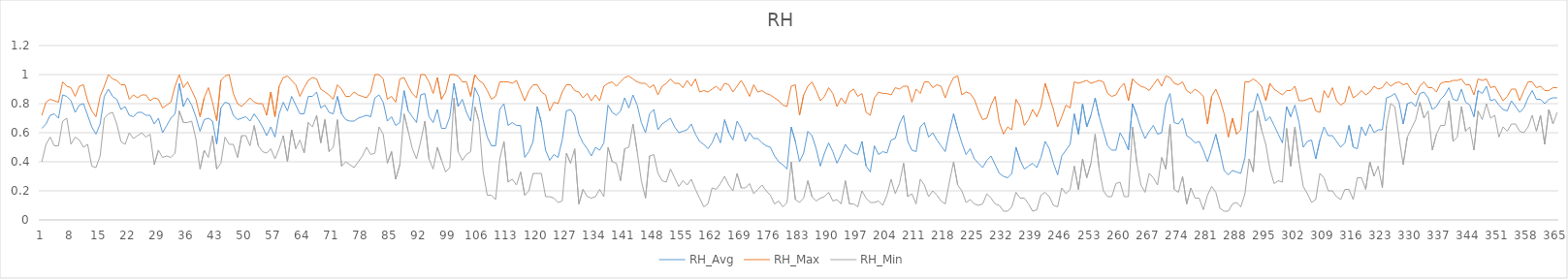
| Category | RH_Avg | RH_Max | RH_Min |
|---|---|---|---|
| 0 | 0.63 | 0.72 | 0.4 |
| 1 | 0.66 | 0.81 | 0.52 |
| 2 | 0.72 | 0.83 | 0.57 |
| 3 | 0.73 | 0.82 | 0.51 |
| 4 | 0.7 | 0.81 | 0.51 |
| 5 | 0.86 | 0.95 | 0.68 |
| 6 | 0.85 | 0.92 | 0.7 |
| 7 | 0.82 | 0.91 | 0.52 |
| 8 | 0.74 | 0.85 | 0.57 |
| 9 | 0.79 | 0.92 | 0.55 |
| 10 | 0.8 | 0.93 | 0.5 |
| 11 | 0.72 | 0.82 | 0.52 |
| 12 | 0.64 | 0.75 | 0.37 |
| 13 | 0.59 | 0.71 | 0.36 |
| 14 | 0.66 | 0.85 | 0.44 |
| 15 | 0.85 | 0.92 | 0.7 |
| 16 | 0.9 | 1 | 0.73 |
| 17 | 0.85 | 0.97 | 0.74 |
| 18 | 0.83 | 0.96 | 0.66 |
| 19 | 0.76 | 0.93 | 0.54 |
| 20 | 0.78 | 0.93 | 0.52 |
| 21 | 0.72 | 0.83 | 0.6 |
| 22 | 0.71 | 0.86 | 0.56 |
| 23 | 0.74 | 0.84 | 0.58 |
| 24 | 0.74 | 0.86 | 0.6 |
| 25 | 0.72 | 0.86 | 0.57 |
| 26 | 0.72 | 0.82 | 0.59 |
| 27 | 0.66 | 0.84 | 0.38 |
| 28 | 0.7 | 0.83 | 0.48 |
| 29 | 0.6 | 0.77 | 0.43 |
| 30 | 0.65 | 0.79 | 0.44 |
| 31 | 0.7 | 0.81 | 0.43 |
| 32 | 0.73 | 0.92 | 0.46 |
| 33 | 0.94 | 1 | 0.75 |
| 34 | 0.78 | 0.91 | 0.67 |
| 35 | 0.84 | 0.95 | 0.67 |
| 36 | 0.79 | 0.89 | 0.68 |
| 37 | 0.71 | 0.83 | 0.56 |
| 38 | 0.61 | 0.71 | 0.35 |
| 39 | 0.69 | 0.84 | 0.48 |
| 40 | 0.7 | 0.91 | 0.43 |
| 41 | 0.68 | 0.81 | 0.58 |
| 42 | 0.52 | 0.68 | 0.35 |
| 43 | 0.77 | 0.96 | 0.39 |
| 44 | 0.81 | 0.99 | 0.57 |
| 45 | 0.8 | 1 | 0.52 |
| 46 | 0.72 | 0.87 | 0.52 |
| 47 | 0.69 | 0.8 | 0.43 |
| 48 | 0.7 | 0.78 | 0.58 |
| 49 | 0.71 | 0.81 | 0.58 |
| 50 | 0.68 | 0.84 | 0.51 |
| 51 | 0.73 | 0.81 | 0.65 |
| 52 | 0.69 | 0.8 | 0.51 |
| 53 | 0.64 | 0.8 | 0.47 |
| 54 | 0.58 | 0.72 | 0.46 |
| 55 | 0.64 | 0.88 | 0.49 |
| 56 | 0.57 | 0.71 | 0.42 |
| 57 | 0.73 | 0.92 | 0.49 |
| 58 | 0.81 | 0.98 | 0.58 |
| 59 | 0.75 | 0.99 | 0.4 |
| 60 | 0.85 | 0.96 | 0.62 |
| 61 | 0.79 | 0.93 | 0.49 |
| 62 | 0.73 | 0.85 | 0.55 |
| 63 | 0.73 | 0.91 | 0.46 |
| 64 | 0.85 | 0.96 | 0.67 |
| 65 | 0.85 | 0.98 | 0.64 |
| 66 | 0.88 | 0.97 | 0.72 |
| 67 | 0.77 | 0.9 | 0.53 |
| 68 | 0.79 | 0.88 | 0.69 |
| 69 | 0.74 | 0.86 | 0.47 |
| 70 | 0.73 | 0.83 | 0.5 |
| 71 | 0.85 | 0.93 | 0.69 |
| 72 | 0.73 | 0.9 | 0.37 |
| 73 | 0.69 | 0.85 | 0.4 |
| 74 | 0.68 | 0.85 | 0.38 |
| 75 | 0.68 | 0.88 | 0.36 |
| 76 | 0.7 | 0.86 | 0.4 |
| 77 | 0.71 | 0.85 | 0.44 |
| 78 | 0.72 | 0.84 | 0.5 |
| 79 | 0.71 | 0.88 | 0.45 |
| 80 | 0.84 | 1 | 0.46 |
| 81 | 0.86 | 1 | 0.64 |
| 82 | 0.81 | 0.97 | 0.59 |
| 83 | 0.68 | 0.83 | 0.39 |
| 84 | 0.71 | 0.85 | 0.47 |
| 85 | 0.65 | 0.81 | 0.28 |
| 86 | 0.67 | 0.97 | 0.38 |
| 87 | 0.89 | 0.98 | 0.73 |
| 88 | 0.75 | 0.92 | 0.61 |
| 89 | 0.71 | 0.87 | 0.49 |
| 90 | 0.67 | 0.84 | 0.42 |
| 91 | 0.86 | 1 | 0.54 |
| 92 | 0.87 | 1 | 0.68 |
| 93 | 0.71 | 0.95 | 0.42 |
| 94 | 0.67 | 0.87 | 0.35 |
| 95 | 0.76 | 0.98 | 0.5 |
| 96 | 0.63 | 0.83 | 0.41 |
| 97 | 0.63 | 0.88 | 0.33 |
| 98 | 0.71 | 1 | 0.36 |
| 99 | 0.94 | 1 | 0.84 |
| 100 | 0.78 | 0.99 | 0.47 |
| 101 | 0.83 | 0.95 | 0.41 |
| 102 | 0.74 | 0.95 | 0.45 |
| 103 | 0.68 | 0.85 | 0.47 |
| 104 | 0.91 | 1 | 0.78 |
| 105 | 0.85 | 0.96 | 0.68 |
| 106 | 0.69 | 0.94 | 0.33 |
| 107 | 0.57 | 0.89 | 0.17 |
| 108 | 0.51 | 0.83 | 0.17 |
| 109 | 0.51 | 0.85 | 0.14 |
| 110 | 0.76 | 0.95 | 0.42 |
| 111 | 0.8 | 0.95 | 0.54 |
| 112 | 0.65 | 0.95 | 0.26 |
| 113 | 0.67 | 0.94 | 0.28 |
| 114 | 0.65 | 0.96 | 0.24 |
| 115 | 0.65 | 0.89 | 0.33 |
| 116 | 0.43 | 0.82 | 0.17 |
| 117 | 0.47 | 0.89 | 0.2 |
| 118 | 0.54 | 0.93 | 0.32 |
| 119 | 0.78 | 0.93 | 0.32 |
| 120 | 0.67 | 0.88 | 0.32 |
| 121 | 0.48 | 0.86 | 0.16 |
| 122 | 0.41 | 0.75 | 0.16 |
| 123 | 0.45 | 0.81 | 0.15 |
| 124 | 0.43 | 0.8 | 0.12 |
| 125 | 0.55 | 0.88 | 0.13 |
| 126 | 0.75 | 0.93 | 0.46 |
| 127 | 0.76 | 0.93 | 0.39 |
| 128 | 0.72 | 0.89 | 0.49 |
| 129 | 0.59 | 0.88 | 0.11 |
| 130 | 0.53 | 0.84 | 0.21 |
| 131 | 0.49 | 0.87 | 0.16 |
| 132 | 0.44 | 0.82 | 0.15 |
| 133 | 0.5 | 0.86 | 0.16 |
| 134 | 0.48 | 0.82 | 0.21 |
| 135 | 0.53 | 0.92 | 0.16 |
| 136 | 0.79 | 0.94 | 0.5 |
| 137 | 0.74 | 0.95 | 0.4 |
| 138 | 0.72 | 0.92 | 0.39 |
| 139 | 0.75 | 0.95 | 0.27 |
| 140 | 0.84 | 0.98 | 0.49 |
| 141 | 0.77 | 0.99 | 0.5 |
| 142 | 0.86 | 0.97 | 0.66 |
| 143 | 0.79 | 0.95 | 0.47 |
| 144 | 0.67 | 0.94 | 0.27 |
| 145 | 0.6 | 0.94 | 0.15 |
| 146 | 0.73 | 0.91 | 0.44 |
| 147 | 0.76 | 0.93 | 0.45 |
| 148 | 0.62 | 0.86 | 0.32 |
| 149 | 0.66 | 0.92 | 0.27 |
| 150 | 0.68 | 0.94 | 0.26 |
| 151 | 0.7 | 0.97 | 0.35 |
| 152 | 0.64 | 0.94 | 0.29 |
| 153 | 0.6 | 0.94 | 0.23 |
| 154 | 0.61 | 0.91 | 0.27 |
| 155 | 0.62 | 0.96 | 0.24 |
| 156 | 0.66 | 0.92 | 0.28 |
| 157 | 0.59 | 0.97 | 0.21 |
| 158 | 0.54 | 0.88 | 0.15 |
| 159 | 0.52 | 0.89 | 0.09 |
| 160 | 0.49 | 0.88 | 0.11 |
| 161 | 0.53 | 0.9 | 0.22 |
| 162 | 0.6 | 0.92 | 0.21 |
| 163 | 0.53 | 0.89 | 0.25 |
| 164 | 0.69 | 0.94 | 0.3 |
| 165 | 0.6 | 0.93 | 0.24 |
| 166 | 0.55 | 0.88 | 0.2 |
| 167 | 0.68 | 0.92 | 0.32 |
| 168 | 0.63 | 0.96 | 0.22 |
| 169 | 0.54 | 0.91 | 0.22 |
| 170 | 0.6 | 0.85 | 0.25 |
| 171 | 0.56 | 0.93 | 0.18 |
| 172 | 0.56 | 0.88 | 0.21 |
| 173 | 0.53 | 0.89 | 0.24 |
| 174 | 0.51 | 0.87 | 0.2 |
| 175 | 0.5 | 0.86 | 0.17 |
| 176 | 0.44 | 0.84 | 0.11 |
| 177 | 0.4 | 0.82 | 0.13 |
| 178 | 0.38 | 0.79 | 0.09 |
| 179 | 0.35 | 0.78 | 0.12 |
| 180 | 0.64 | 0.92 | 0.4 |
| 181 | 0.54 | 0.93 | 0.14 |
| 182 | 0.4 | 0.72 | 0.12 |
| 183 | 0.46 | 0.86 | 0.15 |
| 184 | 0.61 | 0.92 | 0.27 |
| 185 | 0.58 | 0.95 | 0.16 |
| 186 | 0.49 | 0.89 | 0.13 |
| 187 | 0.37 | 0.82 | 0.15 |
| 188 | 0.46 | 0.85 | 0.16 |
| 189 | 0.53 | 0.91 | 0.19 |
| 190 | 0.47 | 0.87 | 0.13 |
| 191 | 0.39 | 0.78 | 0.14 |
| 192 | 0.45 | 0.84 | 0.11 |
| 193 | 0.52 | 0.8 | 0.27 |
| 194 | 0.48 | 0.88 | 0.11 |
| 195 | 0.46 | 0.9 | 0.11 |
| 196 | 0.45 | 0.85 | 0.09 |
| 197 | 0.54 | 0.87 | 0.2 |
| 198 | 0.37 | 0.74 | 0.15 |
| 199 | 0.33 | 0.72 | 0.12 |
| 200 | 0.51 | 0.84 | 0.12 |
| 201 | 0.45 | 0.88 | 0.13 |
| 202 | 0.47 | 0.87 | 0.1 |
| 203 | 0.46 | 0.87 | 0.17 |
| 204 | 0.55 | 0.86 | 0.28 |
| 205 | 0.56 | 0.91 | 0.18 |
| 206 | 0.66 | 0.9 | 0.25 |
| 207 | 0.72 | 0.92 | 0.39 |
| 208 | 0.54 | 0.92 | 0.16 |
| 209 | 0.48 | 0.81 | 0.18 |
| 210 | 0.47 | 0.9 | 0.11 |
| 211 | 0.64 | 0.87 | 0.28 |
| 212 | 0.67 | 0.95 | 0.24 |
| 213 | 0.57 | 0.95 | 0.16 |
| 214 | 0.6 | 0.91 | 0.2 |
| 215 | 0.55 | 0.93 | 0.17 |
| 216 | 0.51 | 0.92 | 0.13 |
| 217 | 0.47 | 0.84 | 0.11 |
| 218 | 0.61 | 0.92 | 0.26 |
| 219 | 0.73 | 0.98 | 0.4 |
| 220 | 0.62 | 0.99 | 0.24 |
| 221 | 0.53 | 0.86 | 0.2 |
| 222 | 0.45 | 0.88 | 0.12 |
| 223 | 0.49 | 0.87 | 0.14 |
| 224 | 0.42 | 0.83 | 0.11 |
| 225 | 0.39 | 0.75 | 0.1 |
| 226 | 0.36 | 0.69 | 0.11 |
| 227 | 0.41 | 0.7 | 0.18 |
| 228 | 0.44 | 0.79 | 0.15 |
| 229 | 0.38 | 0.85 | 0.11 |
| 230 | 0.32 | 0.67 | 0.1 |
| 231 | 0.3 | 0.59 | 0.06 |
| 232 | 0.29 | 0.64 | 0.06 |
| 233 | 0.32 | 0.62 | 0.09 |
| 234 | 0.5 | 0.83 | 0.19 |
| 235 | 0.41 | 0.78 | 0.15 |
| 236 | 0.35 | 0.65 | 0.15 |
| 237 | 0.37 | 0.69 | 0.11 |
| 238 | 0.39 | 0.76 | 0.06 |
| 239 | 0.36 | 0.71 | 0.07 |
| 240 | 0.43 | 0.78 | 0.17 |
| 241 | 0.54 | 0.94 | 0.19 |
| 242 | 0.49 | 0.85 | 0.16 |
| 243 | 0.39 | 0.76 | 0.1 |
| 244 | 0.31 | 0.64 | 0.09 |
| 245 | 0.44 | 0.71 | 0.22 |
| 246 | 0.48 | 0.79 | 0.18 |
| 247 | 0.52 | 0.77 | 0.21 |
| 248 | 0.73 | 0.95 | 0.37 |
| 249 | 0.59 | 0.94 | 0.21 |
| 250 | 0.8 | 0.95 | 0.42 |
| 251 | 0.64 | 0.96 | 0.29 |
| 252 | 0.72 | 0.94 | 0.39 |
| 253 | 0.84 | 0.95 | 0.59 |
| 254 | 0.71 | 0.96 | 0.35 |
| 255 | 0.61 | 0.95 | 0.2 |
| 256 | 0.51 | 0.87 | 0.16 |
| 257 | 0.48 | 0.85 | 0.16 |
| 258 | 0.48 | 0.86 | 0.25 |
| 259 | 0.6 | 0.91 | 0.26 |
| 260 | 0.55 | 0.94 | 0.16 |
| 261 | 0.48 | 0.82 | 0.16 |
| 262 | 0.8 | 0.97 | 0.64 |
| 263 | 0.72 | 0.94 | 0.4 |
| 264 | 0.63 | 0.92 | 0.24 |
| 265 | 0.56 | 0.91 | 0.19 |
| 266 | 0.61 | 0.89 | 0.32 |
| 267 | 0.65 | 0.93 | 0.29 |
| 268 | 0.59 | 0.97 | 0.24 |
| 269 | 0.6 | 0.92 | 0.43 |
| 270 | 0.8 | 0.99 | 0.35 |
| 271 | 0.87 | 0.98 | 0.66 |
| 272 | 0.67 | 0.94 | 0.21 |
| 273 | 0.66 | 0.93 | 0.19 |
| 274 | 0.7 | 0.95 | 0.3 |
| 275 | 0.58 | 0.89 | 0.11 |
| 276 | 0.56 | 0.87 | 0.22 |
| 277 | 0.53 | 0.9 | 0.15 |
| 278 | 0.54 | 0.88 | 0.15 |
| 279 | 0.48 | 0.85 | 0.07 |
| 280 | 0.4 | 0.66 | 0.17 |
| 281 | 0.49 | 0.85 | 0.23 |
| 282 | 0.59 | 0.9 | 0.19 |
| 283 | 0.47 | 0.83 | 0.08 |
| 284 | 0.34 | 0.73 | 0.06 |
| 285 | 0.31 | 0.57 | 0.06 |
| 286 | 0.34 | 0.7 | 0.11 |
| 287 | 0.33 | 0.59 | 0.12 |
| 288 | 0.32 | 0.62 | 0.09 |
| 289 | 0.43 | 0.95 | 0.18 |
| 290 | 0.74 | 0.95 | 0.42 |
| 291 | 0.75 | 0.97 | 0.33 |
| 292 | 0.87 | 0.95 | 0.75 |
| 293 | 0.79 | 0.92 | 0.62 |
| 294 | 0.68 | 0.82 | 0.52 |
| 295 | 0.71 | 0.94 | 0.35 |
| 296 | 0.65 | 0.9 | 0.25 |
| 297 | 0.59 | 0.88 | 0.27 |
| 298 | 0.53 | 0.86 | 0.26 |
| 299 | 0.78 | 0.89 | 0.63 |
| 300 | 0.71 | 0.89 | 0.37 |
| 301 | 0.79 | 0.92 | 0.64 |
| 302 | 0.67 | 0.82 | 0.4 |
| 303 | 0.5 | 0.82 | 0.23 |
| 304 | 0.54 | 0.83 | 0.18 |
| 305 | 0.55 | 0.84 | 0.12 |
| 306 | 0.42 | 0.75 | 0.14 |
| 307 | 0.55 | 0.74 | 0.32 |
| 308 | 0.64 | 0.89 | 0.29 |
| 309 | 0.58 | 0.84 | 0.2 |
| 310 | 0.58 | 0.91 | 0.2 |
| 311 | 0.54 | 0.82 | 0.16 |
| 312 | 0.5 | 0.79 | 0.14 |
| 313 | 0.53 | 0.81 | 0.21 |
| 314 | 0.65 | 0.92 | 0.21 |
| 315 | 0.5 | 0.84 | 0.14 |
| 316 | 0.49 | 0.86 | 0.29 |
| 317 | 0.64 | 0.89 | 0.29 |
| 318 | 0.58 | 0.86 | 0.21 |
| 319 | 0.66 | 0.88 | 0.4 |
| 320 | 0.6 | 0.92 | 0.3 |
| 321 | 0.62 | 0.9 | 0.37 |
| 322 | 0.62 | 0.91 | 0.22 |
| 323 | 0.84 | 0.95 | 0.65 |
| 324 | 0.85 | 0.92 | 0.8 |
| 325 | 0.87 | 0.94 | 0.78 |
| 326 | 0.81 | 0.95 | 0.57 |
| 327 | 0.66 | 0.93 | 0.38 |
| 328 | 0.8 | 0.94 | 0.57 |
| 329 | 0.81 | 0.89 | 0.63 |
| 330 | 0.78 | 0.86 | 0.69 |
| 331 | 0.87 | 0.92 | 0.81 |
| 332 | 0.88 | 0.95 | 0.7 |
| 333 | 0.84 | 0.91 | 0.75 |
| 334 | 0.76 | 0.91 | 0.48 |
| 335 | 0.78 | 0.88 | 0.59 |
| 336 | 0.83 | 0.94 | 0.65 |
| 337 | 0.86 | 0.95 | 0.65 |
| 338 | 0.91 | 0.95 | 0.82 |
| 339 | 0.83 | 0.96 | 0.54 |
| 340 | 0.82 | 0.96 | 0.57 |
| 341 | 0.9 | 0.97 | 0.78 |
| 342 | 0.81 | 0.93 | 0.61 |
| 343 | 0.79 | 0.93 | 0.64 |
| 344 | 0.71 | 0.86 | 0.48 |
| 345 | 0.89 | 0.97 | 0.75 |
| 346 | 0.87 | 0.96 | 0.69 |
| 347 | 0.92 | 0.97 | 0.8 |
| 348 | 0.82 | 0.91 | 0.7 |
| 349 | 0.83 | 0.92 | 0.72 |
| 350 | 0.79 | 0.87 | 0.57 |
| 351 | 0.76 | 0.82 | 0.64 |
| 352 | 0.75 | 0.85 | 0.61 |
| 353 | 0.82 | 0.9 | 0.66 |
| 354 | 0.78 | 0.9 | 0.66 |
| 355 | 0.74 | 0.82 | 0.61 |
| 356 | 0.77 | 0.89 | 0.6 |
| 357 | 0.84 | 0.95 | 0.64 |
| 358 | 0.89 | 0.95 | 0.72 |
| 359 | 0.83 | 0.91 | 0.61 |
| 360 | 0.83 | 0.92 | 0.72 |
| 361 | 0.8 | 0.89 | 0.52 |
| 362 | 0.83 | 0.89 | 0.76 |
| 363 | 0.84 | 0.91 | 0.66 |
| 364 | 0.84 | 0.91 | 0.74 |